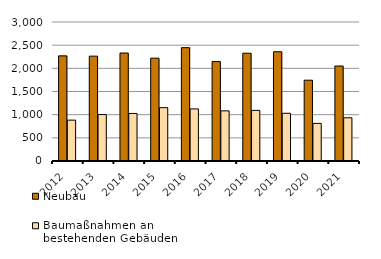
| Category | Neubau | Baumaßnahmen an 
bestehenden Gebäuden |
|---|---|---|
| 2012.0 | 2269 | 882 |
| 2013.0 | 2263 | 1003 |
| 2014.0 | 2330 | 1026 |
| 2015.0 | 2219 | 1151 |
| 2016.0 | 2446 | 1124 |
| 2017.0 | 2146 | 1082 |
| 2018.0 | 2326 | 1092 |
| 2019.0 | 2358 | 1030 |
| 2020.0 | 1744 | 812 |
| 2021.0 | 2050 | 933 |